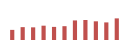
| Category | Importações (2) |
|---|---|
| 0 | 63256.661 |
| 1 | 80362.628 |
| 2 | 79098.748 |
| 3 | 89493.365 |
| 4 | 81914.569 |
| 5 | 86371.3 |
| 6 | 122399.001 |
| 7 | 125153.991 |
| 8 | 116754.909 |
| 9 | 109963.905 |
| 10 | 135113.676 |